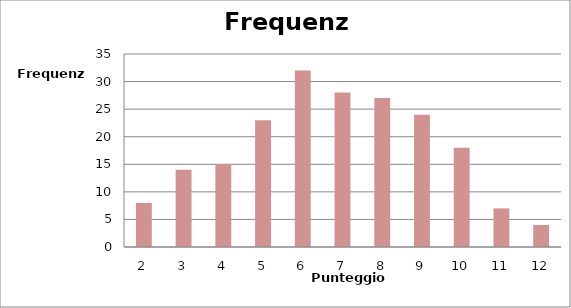
| Category | Frequenza |
|---|---|
| 2.0 | 8 |
| 3.0 | 14 |
| 4.0 | 15 |
| 5.0 | 23 |
| 6.0 | 32 |
| 7.0 | 28 |
| 8.0 | 27 |
| 9.0 | 24 |
| 10.0 | 18 |
| 11.0 | 7 |
| 12.0 | 4 |